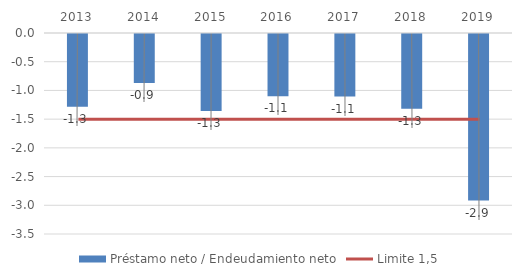
| Category | Préstamo neto / Endeudamiento neto |
|---|---|
| 2013.0 | -1.265 |
| 2014.0 | -0.852 |
| 2015.0 | -1.34 |
| 2016.0 | -1.083 |
| 2017.0 | -1.089 |
| 2018.0 | -1.303 |
| 2019.0 | -2.9 |